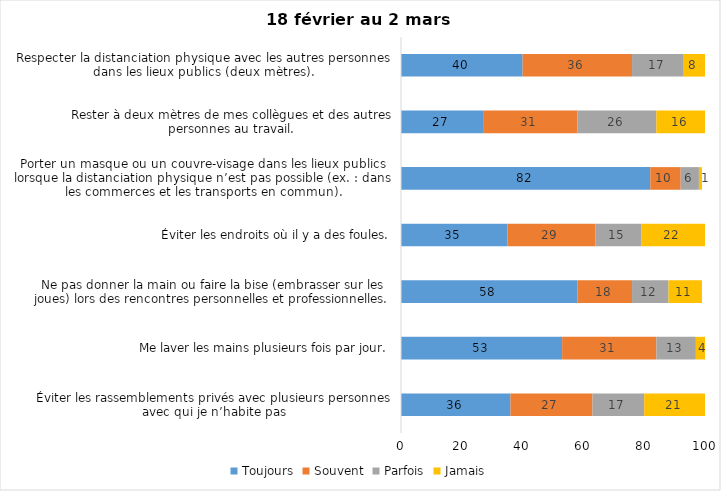
| Category | Toujours | Souvent | Parfois | Jamais |
|---|---|---|---|---|
| Éviter les rassemblements privés avec plusieurs personnes avec qui je n’habite pas | 36 | 27 | 17 | 21 |
| Me laver les mains plusieurs fois par jour. | 53 | 31 | 13 | 4 |
| Ne pas donner la main ou faire la bise (embrasser sur les joues) lors des rencontres personnelles et professionnelles. | 58 | 18 | 12 | 11 |
| Éviter les endroits où il y a des foules. | 35 | 29 | 15 | 22 |
| Porter un masque ou un couvre-visage dans les lieux publics lorsque la distanciation physique n’est pas possible (ex. : dans les commerces et les transports en commun). | 82 | 10 | 6 | 1 |
| Rester à deux mètres de mes collègues et des autres personnes au travail. | 27 | 31 | 26 | 16 |
| Respecter la distanciation physique avec les autres personnes dans les lieux publics (deux mètres). | 40 | 36 | 17 | 8 |